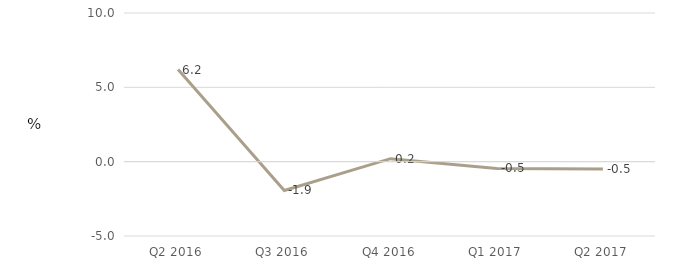
| Category | Financial and insurance activities |
|---|---|
| Q2 2016 | 6.198 |
| Q3 2016 | -1.937 |
| Q4 2016 | 0.202 |
| Q1 2017 | -0.459 |
| Q2 2017 | -0.489 |